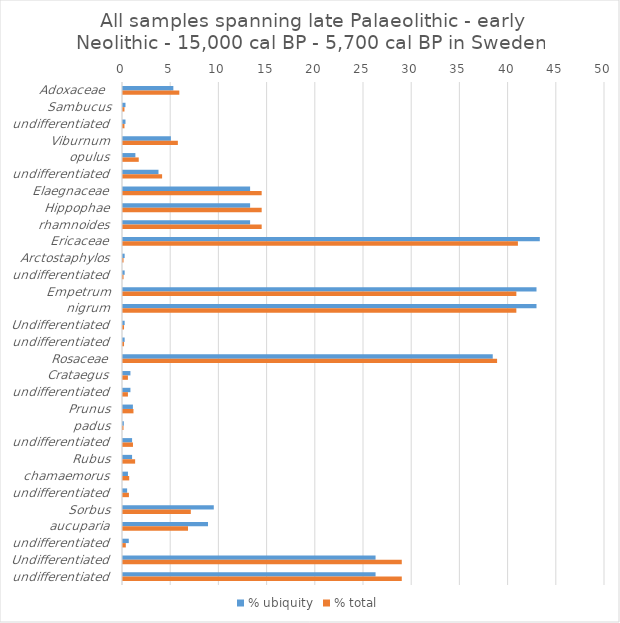
| Category | % ubiquity | % total |
|---|---|---|
| Adoxaceae  | 5.223 | 5.842 |
| Sambucus | 0.257 | 0.152 |
| undifferentiated | 0.257 | 0.152 |
| Viburnum | 4.966 | 5.69 |
| opulus | 1.284 | 1.634 |
| undifferentiated | 3.682 | 4.057 |
| Elaegnaceae | 13.185 | 14.385 |
| Hippophae | 13.185 | 14.385 |
| rhamnoides | 13.185 | 14.385 |
| Ericaceae | 43.236 | 40.966 |
| Arctostaphylos | 0.171 | 0.056 |
| undifferentiated | 0.171 | 0.056 |
| Empetrum | 42.894 | 40.804 |
| nigrum | 42.894 | 40.804 |
| Undifferentiated | 0.171 | 0.107 |
| undifferentiated | 0.171 | 0.107 |
| Rosaceae | 38.356 | 38.806 |
| Crataegus | 0.771 | 0.51 |
| undifferentiated | 0.771 | 0.51 |
| Prunus | 1.027 | 1.085 |
| padus | 0.086 | 0.051 |
| undifferentiated | 0.942 | 1.034 |
| Rubus | 0.942 | 1.258 |
| chamaemorus | 0.514 | 0.643 |
| undifferentiated | 0.428 | 0.615 |
| Sorbus | 9.418 | 7.033 |
| aucuparia | 8.818 | 6.743 |
| undifferentiated | 0.599 | 0.291 |
| Undifferentiated | 26.199 | 28.919 |
| undifferentiated | 26.199 | 28.919 |